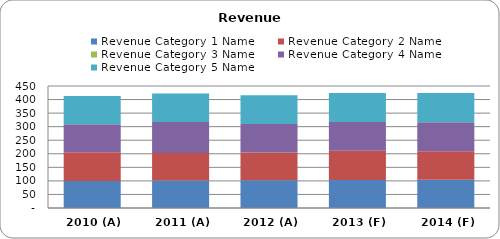
| Category | Revenue Category 1 Name | Revenue Category 2 Name | Revenue Category 3 Name | Revenue Category 4 Name | Revenue Category 5 Name |
|---|---|---|---|---|---|
| 2010 (A)  | 100 | 106 | 0 | 103 | 104 |
| 2011 (A)  | 101 | 102 | 0 | 114 | 105 |
| 2012 (A)  | 102 | 103 | 0 | 105 | 106 |
| 2013 (F)  | 103 | 108 | 0 | 106 | 107 |
| 2014 (F)  | 104 | 105 | 0 | 107 | 108 |